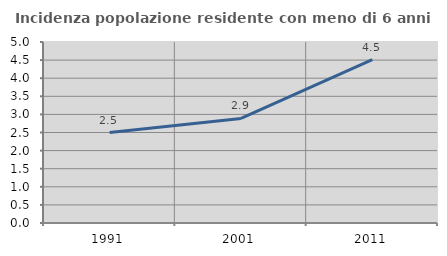
| Category | Incidenza popolazione residente con meno di 6 anni |
|---|---|
| 1991.0 | 2.5 |
| 2001.0 | 2.889 |
| 2011.0 | 4.515 |